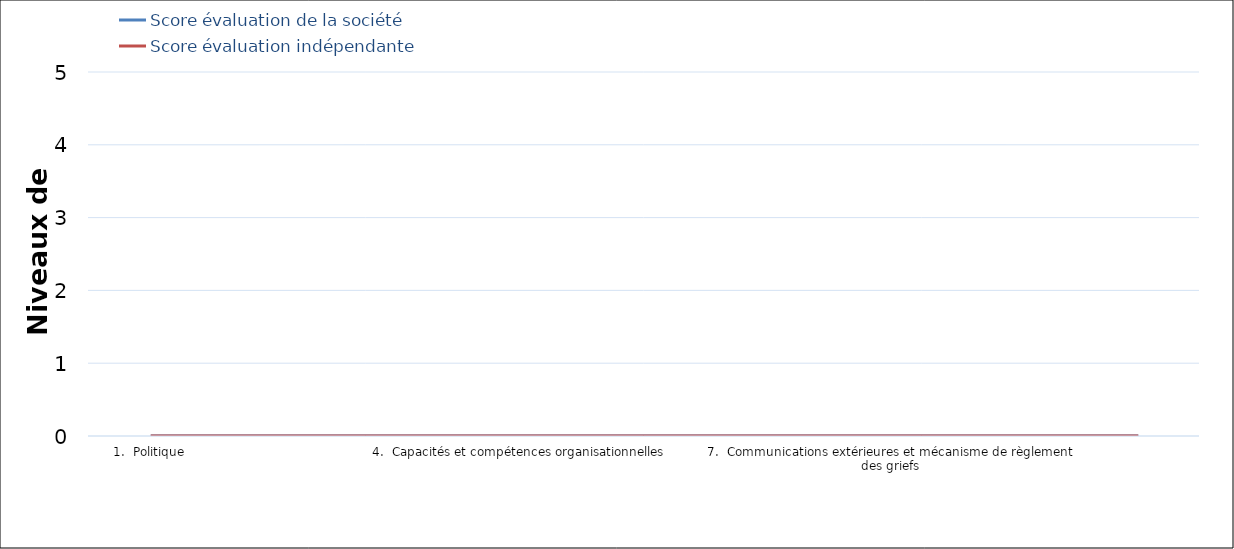
| Category | Score évaluation de la société | Score évaluation indépendante |
|---|---|---|
| 1.  Politique | 0 | 0 |
| 2. Identification des risques et des impacts | 0 | 0 |
| 3. Programmes de gestion | 0 | 0 |
| 4.  Capacités et compétences organisationnelles | 0 | 0 |
| 5. Préparation et réponse aux situations d’urgence | 0 | 0 |
| 6. Engagement des parties prenantes | 0 | 0 |
| 7.  Communications extérieures et mécanisme de règlement des griefs | 0 | 0 |
| 8. Divulgation continue de l’information aux communautés affectées | 0 | 0 |
| 9. Suivi et évaluation | 0 | 0 |